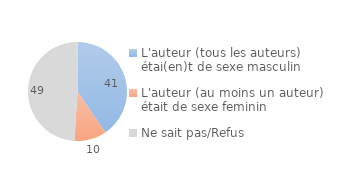
| Category | Series 0 |
|---|---|
| L'auteur (tous les auteurs) étai(en)t de sexe masculin | 40.513 |
| L'auteur (au moins un auteur) était de sexe feminin | 10.488 |
| Ne sait pas/Refus | 48.999 |